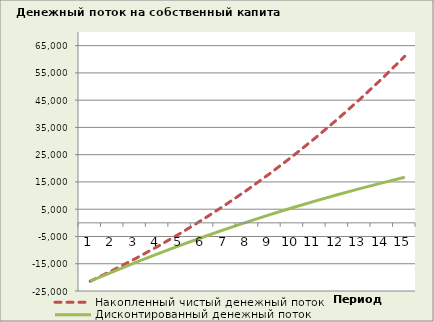
| Category | Накопленный чистый денежный поток | Дисконтированный денежный поток |
|---|---|---|
| 0 | -21400.688 | -21400.688 |
| 1 | -17413.116 | -17944.324 |
| 2 | -13173.161 | -14603.3 |
| 3 | -8671.746 | -11378.709 |
| 4 | -3899.432 | -8270.845 |
| 5 | 1153.598 | -5279.324 |
| 6 | 6497.553 | -2403.182 |
| 7 | 12143.052 | 359.031 |
| 8 | 18101.136 | 3009.171 |
| 9 | 24383.289 | 5549.43 |
| 10 | 31001.456 | 7982.275 |
| 11 | 37968.058 | 10310.394 |
| 12 | 45296.013 | 12536.646 |
| 13 | 52998.755 | 14664.021 |
| 14 | 61090.258 | 16695.607 |